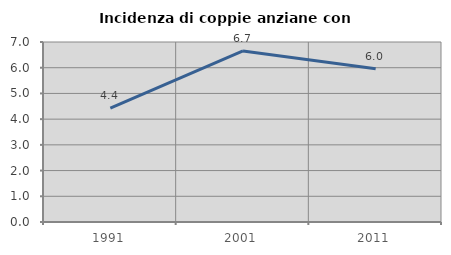
| Category | Incidenza di coppie anziane con figli |
|---|---|
| 1991.0 | 4.424 |
| 2001.0 | 6.653 |
| 2011.0 | 5.962 |